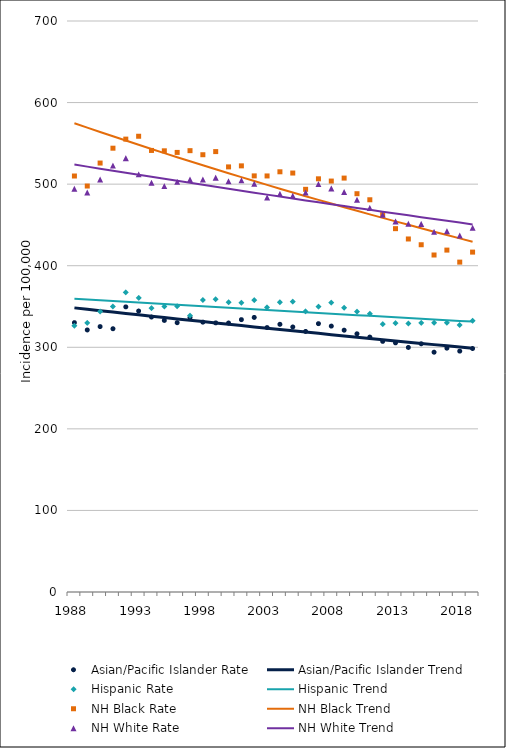
| Category | Asian/Pacific Islander Rate | Asian/Pacific Islander Trend | Hispanic Rate | Hispanic Trend | NH Black Rate | NH Black Trend | NH White Rate | NH White Trend |
|---|---|---|---|---|---|---|---|---|
| 1988.0 | 330.24 | 348.32 | 326.39 | 359.54 | 509.97 | 574.63 | 494.36 | 524.04 |
| 1989.0 | 321.25 | 346.6 | 330.02 | 358.6 | 497.69 | 569.26 | 489.77 | 521.49 |
| 1990.0 | 325.38 | 344.89 | 343.95 | 357.66 | 525.85 | 563.94 | 505.61 | 518.96 |
| 1991.0 | 322.74 | 343.18 | 350.05 | 356.72 | 544.07 | 558.67 | 522.78 | 516.44 |
| 1992.0 | 349.55 | 341.49 | 367.39 | 355.79 | 555.19 | 553.44 | 531.85 | 513.93 |
| 1993.0 | 344.46 | 339.81 | 360.56 | 354.86 | 558.71 | 548.27 | 511.98 | 511.44 |
| 1994.0 | 337.09 | 338.13 | 347.92 | 353.93 | 541.32 | 543.14 | 501.79 | 508.96 |
| 1995.0 | 332.92 | 336.46 | 349.99 | 353 | 540.86 | 538.06 | 497.65 | 506.48 |
| 1996.0 | 330.14 | 334.8 | 350.26 | 352.08 | 538.9 | 533.03 | 502.81 | 504.03 |
| 1997.0 | 336.54 | 333.15 | 338.86 | 351.16 | 541.05 | 528.05 | 505.8 | 501.58 |
| 1998.0 | 330.84 | 331.5 | 358.09 | 350.24 | 536.07 | 523.11 | 505.61 | 499.14 |
| 1999.0 | 329.93 | 329.87 | 358.94 | 349.32 | 539.9 | 518.22 | 507.98 | 496.72 |
| 2000.0 | 329.77 | 328.24 | 355.24 | 348.41 | 521.14 | 513.37 | 503.56 | 494.31 |
| 2001.0 | 333.89 | 326.62 | 354.47 | 347.5 | 522.42 | 508.57 | 504.65 | 491.91 |
| 2002.0 | 336.62 | 325.01 | 357.73 | 346.59 | 510.12 | 503.82 | 500.48 | 489.52 |
| 2003.0 | 324.17 | 323.4 | 348.96 | 345.68 | 510.05 | 499.11 | 483.64 | 487.14 |
| 2004.0 | 328.17 | 321.81 | 355.28 | 344.78 | 515.14 | 494.44 | 487.95 | 484.78 |
| 2005.0 | 324.87 | 320.22 | 356.08 | 343.88 | 513.61 | 489.82 | 485.82 | 482.42 |
| 2006.0 | 319.41 | 318.64 | 344.02 | 342.98 | 493.65 | 485.24 | 489.73 | 480.08 |
| 2007.0 | 328.96 | 317.07 | 349.8 | 342.08 | 506.53 | 480.7 | 500.05 | 477.75 |
| 2008.0 | 325.99 | 315.5 | 354.75 | 341.18 | 503.77 | 476.21 | 494.76 | 475.43 |
| 2009.0 | 320.97 | 313.95 | 348.37 | 340.29 | 507.42 | 471.76 | 490.29 | 473.12 |
| 2010.0 | 316.53 | 312.4 | 343.78 | 339.4 | 488.27 | 467.34 | 480.9 | 470.83 |
| 2011.0 | 312.52 | 310.86 | 341.12 | 338.51 | 480.85 | 462.97 | 470.9 | 468.54 |
| 2012.0 | 307.27 | 309.32 | 328.44 | 337.63 | 462.66 | 458.65 | 462.4 | 466.26 |
| 2013.0 | 305.42 | 307.79 | 329.64 | 336.74 | 445.43 | 454.36 | 454.33 | 464 |
| 2014.0 | 299.81 | 306.28 | 329.18 | 335.86 | 432.78 | 450.11 | 451.5 | 461.75 |
| 2015.0 | 304.31 | 304.76 | 330 | 334.98 | 425.71 | 445.9 | 451.22 | 459.51 |
| 2016.0 | 293.97 | 303.26 | 330.13 | 334.11 | 413.14 | 441.73 | 441.5 | 457.27 |
| 2017.0 | 298.95 | 301.76 | 330.13 | 333.23 | 419.15 | 437.6 | 442.38 | 455.05 |
| 2018.0 | 295.28 | 300.27 | 327.31 | 332.36 | 404.41 | 433.51 | 437.07 | 452.85 |
| 2019.0 | 298.5 | 298.79 | 332.54 | 331.49 | 416.68 | 429.46 | 446.54 | 450.65 |